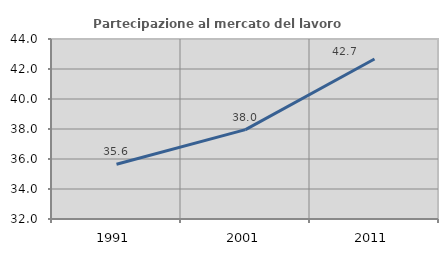
| Category | Partecipazione al mercato del lavoro  femminile |
|---|---|
| 1991.0 | 35.649 |
| 2001.0 | 37.956 |
| 2011.0 | 42.668 |